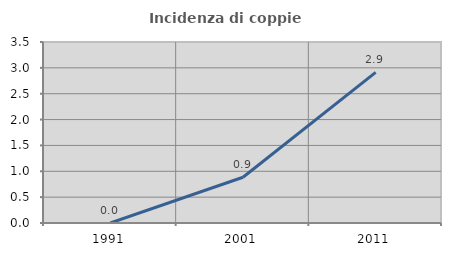
| Category | Incidenza di coppie miste |
|---|---|
| 1991.0 | 0 |
| 2001.0 | 0.885 |
| 2011.0 | 2.913 |